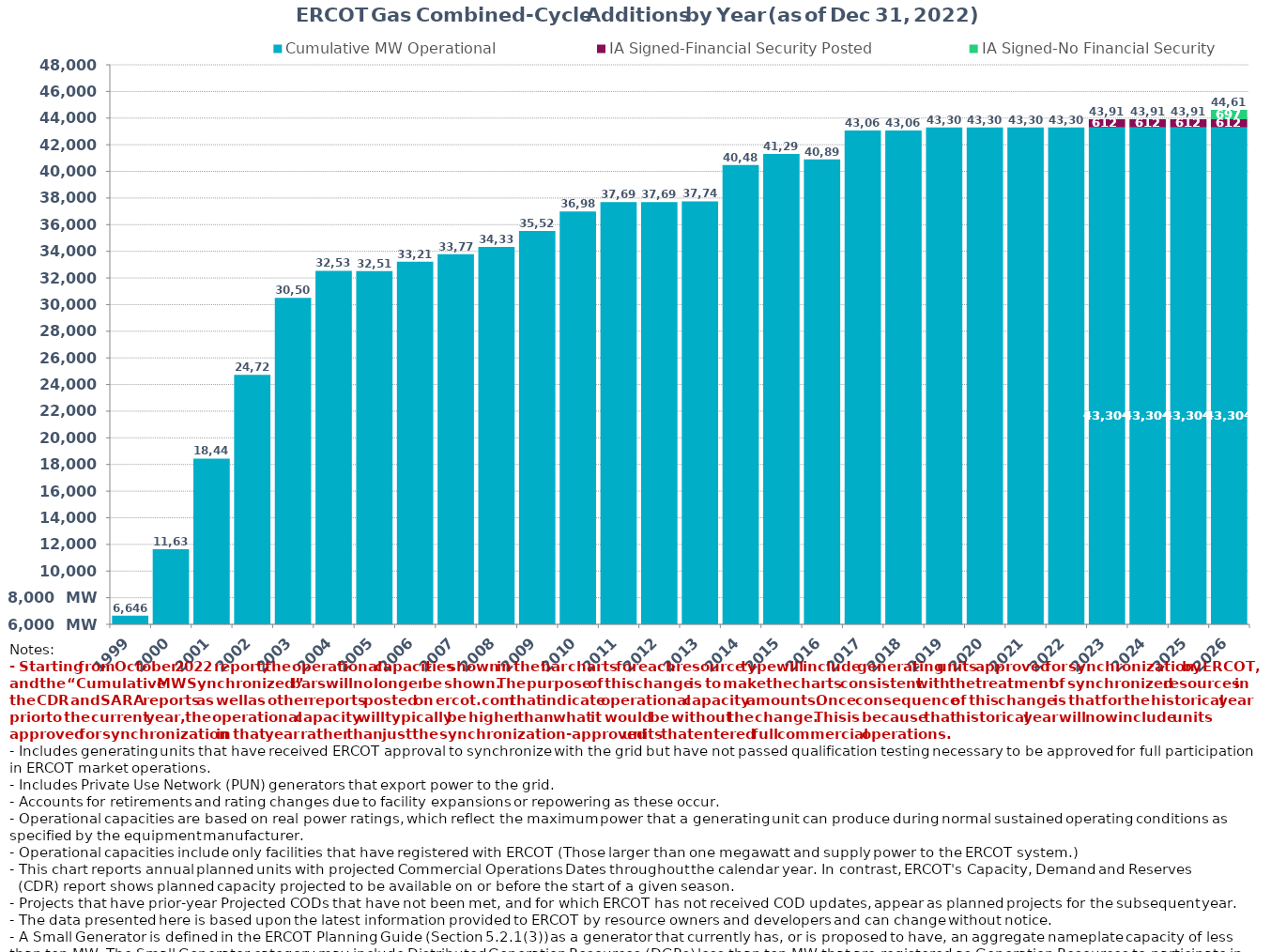
| Category | Cumulative MW Operational  | IA Signed-Financial Security Posted  | IA Signed-No Financial Security  | Small Generator | Cumulative Installed and Planned |
|---|---|---|---|---|---|
| 1999.0 | 6646.189 | 0 | 0 | 0 | 6646.189 |
| 2000.0 | 11630.519 | 0 | 0 | 0 | 11630.519 |
| 2001.0 | 18443.659 | 0 | 0 | 0 | 18443.659 |
| 2002.0 | 24721.899 | 0 | 0 | 0 | 24721.899 |
| 2003.0 | 30504.999 | 0 | 0 | 0 | 30504.999 |
| 2004.0 | 32535.519 | 0 | 0 | 0 | 32535.519 |
| 2005.0 | 32514.619 | 0 | 0 | 0 | 32514.619 |
| 2006.0 | 33218.819 | 0 | 0 | 0 | 33218.819 |
| 2007.0 | 33776.119 | 0 | 0 | 0 | 33776.119 |
| 2008.0 | 34337.219 | 0 | 0 | 0 | 34337.219 |
| 2009.0 | 35520.599 | 0 | 0 | 0 | 35520.599 |
| 2010.0 | 36980.799 | 0 | 0 | 0 | 36980.799 |
| 2011.0 | 37699.199 | 0 | 0 | 0 | 37699.199 |
| 2012.0 | 37699.199 | 0 | 0 | 0 | 37699.199 |
| 2013.0 | 37749.199 | 0 | 0 | 0 | 37749.199 |
| 2014.0 | 40480.999 | 0 | 0 | 0 | 40480.999 |
| 2015.0 | 41298.099 | 0 | 0 | 0 | 41298.099 |
| 2016.0 | 40899.109 | 0 | 0 | 0 | 40899.109 |
| 2017.0 | 43063.379 | 0 | 0 | 0 | 43063.379 |
| 2018.0 | 43063.379 | 0 | 0 | 0 | 43063.379 |
| 2019.0 | 43303.779 | 0 | 0 | 0 | 43303.779 |
| 2020.0 | 43303.779 | 0 | 0 | 0 | 43303.779 |
| 2021.0 | 43303.779 | 0 | 0 | 0 | 43303.779 |
| 2022.0 | 43303.779 | 0 | 0 | 0 | 43303.779 |
| 2023.0 | 43303.779 | 612 | 0 | 0 | 43915.779 |
| 2024.0 | 43303.779 | 612 | 0 | 0 | 43915.779 |
| 2025.0 | 43303.779 | 612 | 0 | 0 | 43915.779 |
| 2026.0 | 43303.779 | 612 | 697 | 0 | 44612.779 |